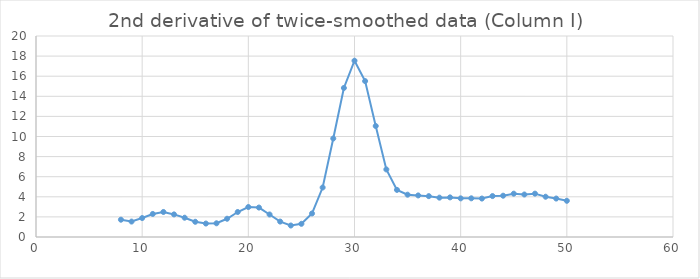
| Category | Series 0 |
|---|---|
| 8.0 | 1.722 |
| 9.0 | 1.537 |
| 10.0 | 1.886 |
| 11.0 | 2.294 |
| 12.0 | 2.49 |
| 13.0 | 2.248 |
| 14.0 | 1.918 |
| 15.0 | 1.515 |
| 16.0 | 1.34 |
| 17.0 | 1.364 |
| 18.0 | 1.817 |
| 19.0 | 2.487 |
| 20.0 | 2.982 |
| 21.0 | 2.93 |
| 22.0 | 2.241 |
| 23.0 | 1.534 |
| 24.0 | 1.144 |
| 25.0 | 1.313 |
| 26.0 | 2.342 |
| 27.0 | 4.924 |
| 28.0 | 9.803 |
| 29.0 | 14.83 |
| 30.0 | 17.541 |
| 31.0 | 15.514 |
| 32.0 | 11.044 |
| 33.0 | 6.722 |
| 34.0 | 4.688 |
| 35.0 | 4.211 |
| 36.0 | 4.136 |
| 37.0 | 4.066 |
| 38.0 | 3.916 |
| 39.0 | 3.942 |
| 40.0 | 3.845 |
| 41.0 | 3.85 |
| 42.0 | 3.825 |
| 43.0 | 4.073 |
| 44.0 | 4.109 |
| 45.0 | 4.311 |
| 46.0 | 4.23 |
| 47.0 | 4.314 |
| 48.0 | 4.007 |
| 49.0 | 3.826 |
| 50.0 | 3.603 |